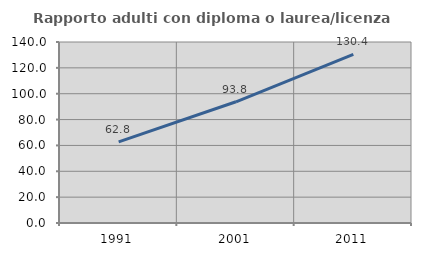
| Category | Rapporto adulti con diploma o laurea/licenza media  |
|---|---|
| 1991.0 | 62.778 |
| 2001.0 | 93.772 |
| 2011.0 | 130.354 |